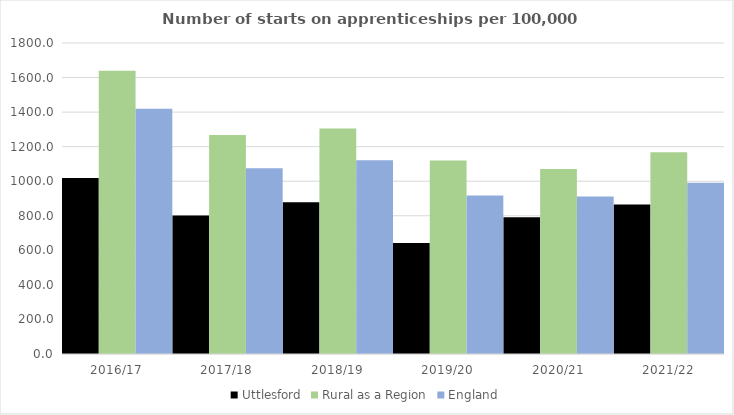
| Category | Uttlesford | Rural as a Region | England |
|---|---|---|---|
| 2016/17 | 1019 | 1638.789 | 1420 |
| 2017/18 | 802 | 1267.474 | 1075 |
| 2018/19 | 878 | 1304.57 | 1122 |
| 2019/20 | 643 | 1119.662 | 918 |
| 2020/21 | 792 | 1070.748 | 912 |
| 2021/22 | 865 | 1167.68 | 991 |